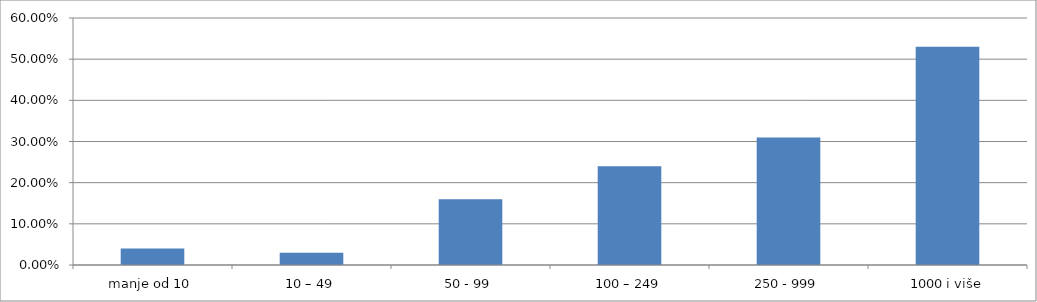
| Category | Series 0 |
|---|---|
| manje od 10 | 0.04 |
| 10 – 49 | 0.03 |
| 50 - 99 | 0.16 |
| 100 – 249 | 0.24 |
| 250 - 999 | 0.31 |
| 1000 i više | 0.53 |